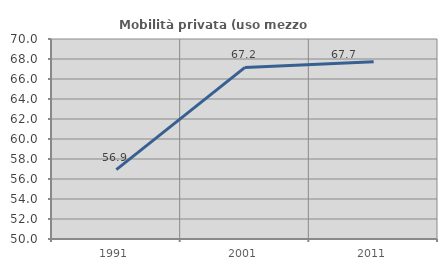
| Category | Mobilità privata (uso mezzo privato) |
|---|---|
| 1991.0 | 56.943 |
| 2001.0 | 67.158 |
| 2011.0 | 67.735 |